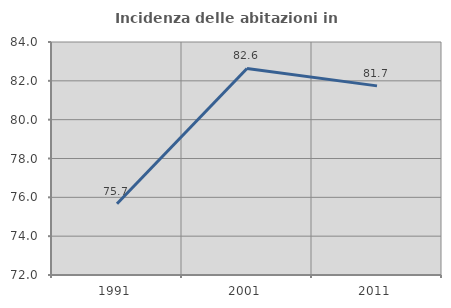
| Category | Incidenza delle abitazioni in proprietà  |
|---|---|
| 1991.0 | 75.668 |
| 2001.0 | 82.639 |
| 2011.0 | 81.741 |